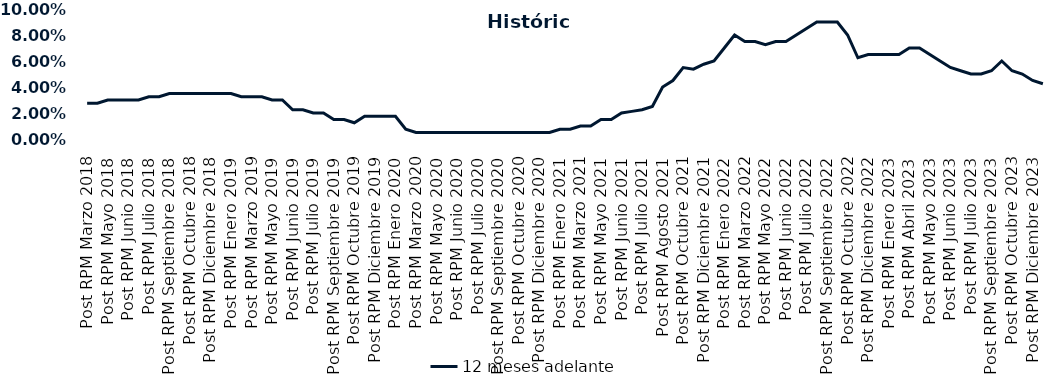
| Category | 12 meses adelante  |
|---|---|
| Post RPM Marzo 2018 | 0.028 |
| Pre RPM Mayo 2018 | 0.028 |
| Post RPM Mayo 2018 | 0.03 |
| Pre RPM Junio 2018 | 0.03 |
| Post RPM Junio 2018 | 0.03 |
| Pre RPM Julio 2018 | 0.03 |
| Post RPM Julio 2018 | 0.032 |
| Pre RPM Septiembre 2018 | 0.032 |
| Post RPM Septiembre 2018 | 0.035 |
| Pre RPM Octubre 2018 | 0.035 |
| Post RPM Octubre 2018 | 0.035 |
| Pre RPM Diciembre 2018 | 0.035 |
| Post RPM Diciembre 2018 | 0.035 |
| Pre RPM Enero 2019 | 0.035 |
| Post RPM Enero 2019 | 0.035 |
| Pre RPM Marzo 2019 | 0.032 |
| Post RPM Marzo 2019 | 0.032 |
| Pre RPM Mayo 2019 | 0.032 |
| Post RPM Mayo 2019 | 0.03 |
| Pre RPM Junio 2019 | 0.03 |
| Post RPM Junio 2019 | 0.022 |
| Pre RPM Julio 2019 | 0.022 |
| Post RPM Julio 2019 | 0.02 |
| Pre RPM Septiembre 2019 | 0.02 |
| Post RPM Septiembre 2019 | 0.015 |
| Pre RPM Octubre 2019 | 0.015 |
| Post RPM Octubre 2019 | 0.012 |
| Pre RPM Diciembre 2019 | 0.018 |
| Post RPM Diciembre 2019 | 0.018 |
| Pre RPM Enero 2020 | 0.018 |
| Post RPM Enero 2020 | 0.018 |
| Pre RPM Marzo 2020 | 0.008 |
| Post RPM Marzo 2020 | 0.005 |
| Pre RPM Mayo 2020 | 0.005 |
| Post RPM Mayo 2020 | 0.005 |
| Pre RPM Junio 2020 | 0.005 |
| Post RPM Junio 2020 | 0.005 |
| Pre RPM Julio 2020 | 0.005 |
| Post RPM Julio 2020 | 0.005 |
| Pre RPM Septiembre 2020 | 0.005 |
| Post RPM Septiembre 2020 | 0.005 |
| Pre RPM Octubre 2020 | 0.005 |
| Post RPM Octubre 2020 | 0.005 |
| Pre RPM Diciembre 2020 | 0.005 |
| Post RPM Diciembre 2020 | 0.005 |
| Pre RPM Enero 2021 | 0.005 |
| Post RPM Enero 2021 | 0.008 |
| Pre RPM Marzo 2021 | 0.008 |
| Post RPM Marzo 2021 | 0.01 |
| Pre RPM Mayo 2021 | 0.01 |
| Post RPM Mayo 2021 | 0.015 |
| Pre RPM Junio 2021 | 0.015 |
| Post RPM Junio 2021 | 0.02 |
| Pre RPM Julio 2021 | 0.021 |
| Post RPM Julio 2021 | 0.022 |
| Pre RPM Agosto 2021 | 0.025 |
| Post RPM Agosto 2021 | 0.04 |
| Pre RPM Octubre 2021 | 0.045 |
| Post RPM Octubre 2021 | 0.055 |
| Pre RPM Diciembre 2021 | 0.054 |
| Post RPM Diciembre 2021 | 0.058 |
| Pre RPM Enero 2022 | 0.06 |
| Post RPM Enero 2022 | 0.07 |
| Pre RPM Marzo 2022 | 0.08 |
| Post RPM Marzo 2022 | 0.075 |
| Pre RPM Mayo 2022 | 0.075 |
| Post RPM Mayo 2022 | 0.072 |
| Pre RPM Junio 2022 | 0.075 |
| Post RPM Junio 2022 | 0.075 |
| Pre RPM Julio 2022 | 0.08 |
| Post RPM Julio 2022 | 0.085 |
| Pre RPM Septiembre 2022 | 0.09 |
| Post RPM Septiembre 2022 | 0.09 |
| Pre RPM Octubre 2022 | 0.09 |
| Post RPM Octubre 2022 | 0.08 |
| Pre RPM Diciembre 2022 | 0.062 |
| Post RPM Diciembre 2022 | 0.065 |
| Pre RPM Enero 2023 | 0.065 |
| Post RPM Enero 2023 | 0.065 |
| Pre RPM Abril 2023 | 0.065 |
| Post RPM Abril 2023 | 0.07 |
| Pre RPM Mayo 2023 | 0.07 |
| Post RPM Mayo 2023 | 0.065 |
| Pre RPM Junio 2023 | 0.06 |
| Post RPM Junio 2023 | 0.055 |
| Pre RPM Julio 2023 | 0.052 |
| Post RPM Julio 2023 | 0.05 |
| Pre RPM Septiembre 2023 | 0.05 |
| Post RPM Septiembre 2023 | 0.052 |
| Pre RPM Octubre 2023 | 0.06 |
| Post RPM Octubre 2023 | 0.052 |
| Pre RPM Diciembre 2023 | 0.05 |
| Post RPM Diciembre 2023 | 0.045 |
| Pre RPM Enero 2024 | 0.042 |